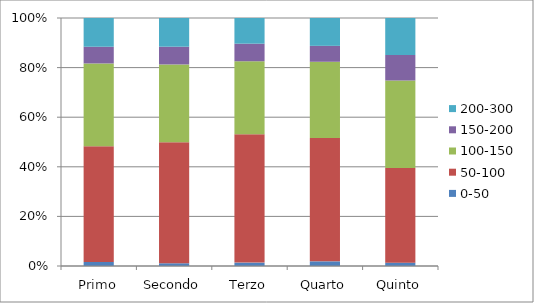
| Category | 0-50 | 50-100 | 100-150 | 150-200 | 200-300 |
|---|---|---|---|---|---|
| Primo | 6 | 173 | 124 | 25 | 43 |
| Secondo | 4 | 177 | 114 | 26 | 42 |
| Terzo | 5 | 190 | 108 | 26 | 38 |
| Quarto | 7 | 186 | 115 | 24 | 42 |
| Quinto | 5 | 141 | 130 | 38 | 55 |